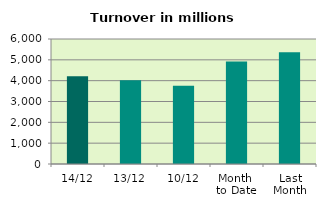
| Category | Series 0 |
|---|---|
| 14/12 | 4210.504 |
| 13/12 | 4025.891 |
| 10/12 | 3759.788 |
| Month 
to Date | 4920.862 |
| Last
Month | 5362.851 |